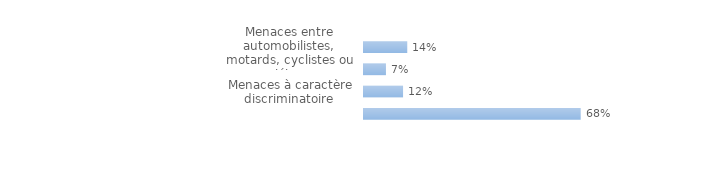
| Category | Series 0 |
|---|---|
| Menaces entre automobilistes, motards, cyclistes ou piétons | 0.135 |
| Menaces à la suite d'une sollicitation d'un inconnu | 0.069 |
| Menaces à caractère discriminatoire  | 0.122 |
| Autres menaces | 0.677 |